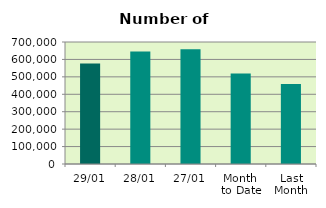
| Category | Series 0 |
|---|---|
| 29/01 | 577272 |
| 28/01 | 645704 |
| 27/01 | 658218 |
| Month 
to Date | 518912.2 |
| Last
Month | 458836.4 |